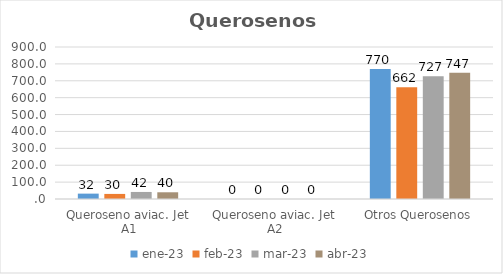
| Category | ene-23 | feb-23 | mar-23 | abr-23 |
|---|---|---|---|---|
| Queroseno aviac. Jet A1 | 31.808 | 30.06 | 41.706 | 39.786 |
| Queroseno aviac. Jet A2 | 0 | 0 | 0 | 0 |
| Otros Querosenos | 770.021 | 662.088 | 727.114 | 747.343 |